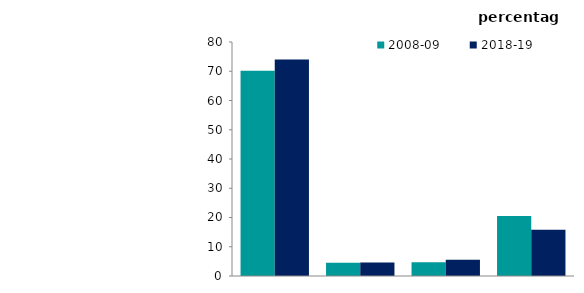
| Category | 2008-09 | 2018-19 |
|---|---|---|
| 0 | 70.184 | 74.046 |
| 1 | 4.56 | 4.605 |
| 2 | 4.71 | 5.532 |
| 3 | 20.546 | 15.817 |